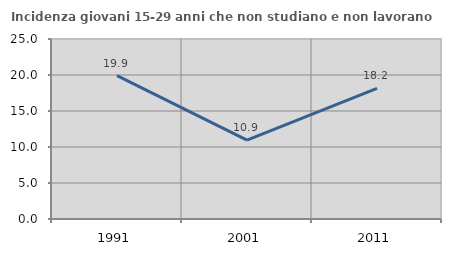
| Category | Incidenza giovani 15-29 anni che non studiano e non lavorano  |
|---|---|
| 1991.0 | 19.907 |
| 2001.0 | 10.943 |
| 2011.0 | 18.153 |